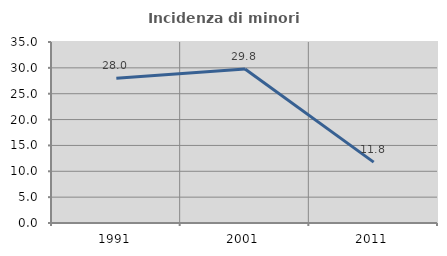
| Category | Incidenza di minori stranieri |
|---|---|
| 1991.0 | 28 |
| 2001.0 | 29.787 |
| 2011.0 | 11.765 |